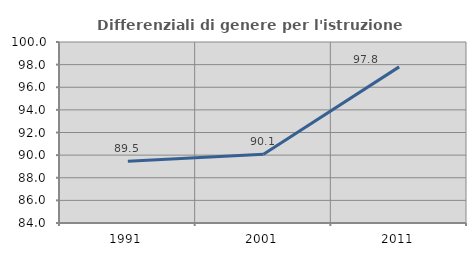
| Category | Differenziali di genere per l'istruzione superiore |
|---|---|
| 1991.0 | 89.455 |
| 2001.0 | 90.081 |
| 2011.0 | 97.802 |